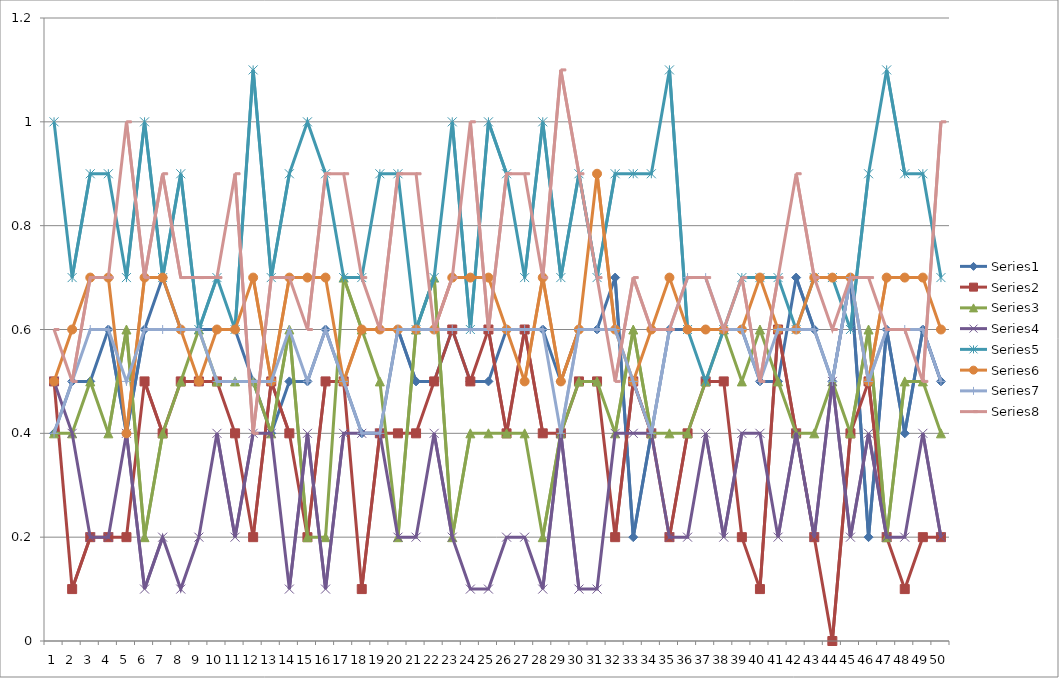
| Category | Series 0 | Series 1 | Series 2 | Series 3 | Series 4 | Series 5 | Series 6 | Series 7 |
|---|---|---|---|---|---|---|---|---|
| 0 | 0.4 | 0.5 | 0.4 | 0.5 | 1 | 0.5 | 0.4 | 0.6 |
| 1 | 0.5 | 0.1 | 0.4 | 0.4 | 0.7 | 0.6 | 0.5 | 0.5 |
| 2 | 0.5 | 0.2 | 0.5 | 0.2 | 0.9 | 0.7 | 0.6 | 0.7 |
| 3 | 0.6 | 0.2 | 0.4 | 0.2 | 0.9 | 0.7 | 0.6 | 0.7 |
| 4 | 0.4 | 0.2 | 0.6 | 0.4 | 0.7 | 0.4 | 0.5 | 1 |
| 5 | 0.6 | 0.5 | 0.2 | 0.1 | 1 | 0.7 | 0.6 | 0.7 |
| 6 | 0.7 | 0.4 | 0.4 | 0.2 | 0.7 | 0.7 | 0.6 | 0.9 |
| 7 | 0.6 | 0.5 | 0.5 | 0.1 | 0.9 | 0.6 | 0.6 | 0.7 |
| 8 | 0.6 | 0.5 | 0.6 | 0.2 | 0.6 | 0.5 | 0.6 | 0.7 |
| 9 | 0.6 | 0.5 | 0.5 | 0.4 | 0.7 | 0.6 | 0.5 | 0.7 |
| 10 | 0.6 | 0.4 | 0.5 | 0.2 | 0.6 | 0.6 | 0.5 | 0.9 |
| 11 | 0.5 | 0.2 | 0.5 | 0.4 | 1.1 | 0.7 | 0.5 | 0.4 |
| 12 | 0.4 | 0.5 | 0.4 | 0.4 | 0.7 | 0.5 | 0.5 | 0.7 |
| 13 | 0.5 | 0.4 | 0.6 | 0.1 | 0.9 | 0.7 | 0.6 | 0.7 |
| 14 | 0.5 | 0.2 | 0.2 | 0.4 | 1 | 0.7 | 0.5 | 0.6 |
| 15 | 0.6 | 0.5 | 0.2 | 0.1 | 0.9 | 0.7 | 0.6 | 0.9 |
| 16 | 0.5 | 0.5 | 0.7 | 0.4 | 0.7 | 0.5 | 0.5 | 0.9 |
| 17 | 0.4 | 0.1 | 0.6 | 0.4 | 0.7 | 0.6 | 0.4 | 0.7 |
| 18 | 0.4 | 0.4 | 0.5 | 0.4 | 0.9 | 0.6 | 0.4 | 0.6 |
| 19 | 0.6 | 0.4 | 0.2 | 0.2 | 0.9 | 0.6 | 0.6 | 0.9 |
| 20 | 0.5 | 0.4 | 0.6 | 0.2 | 0.6 | 0.6 | 0.6 | 0.9 |
| 21 | 0.5 | 0.5 | 0.7 | 0.4 | 0.7 | 0.6 | 0.6 | 0.6 |
| 22 | 0.6 | 0.6 | 0.2 | 0.2 | 1 | 0.7 | 0.6 | 0.7 |
| 23 | 0.5 | 0.5 | 0.4 | 0.1 | 0.6 | 0.7 | 0.6 | 1 |
| 24 | 0.5 | 0.6 | 0.4 | 0.1 | 1 | 0.7 | 0.6 | 0.6 |
| 25 | 0.6 | 0.4 | 0.4 | 0.2 | 0.9 | 0.6 | 0.6 | 0.9 |
| 26 | 0.6 | 0.6 | 0.4 | 0.2 | 0.7 | 0.5 | 0.6 | 0.9 |
| 27 | 0.6 | 0.4 | 0.2 | 0.1 | 1 | 0.7 | 0.6 | 0.7 |
| 28 | 0.5 | 0.4 | 0.4 | 0.4 | 0.7 | 0.5 | 0.4 | 1.1 |
| 29 | 0.6 | 0.5 | 0.5 | 0.1 | 0.9 | 0.6 | 0.6 | 0.9 |
| 30 | 0.6 | 0.5 | 0.5 | 0.1 | 0.7 | 0.9 | 0.6 | 0.7 |
| 31 | 0.7 | 0.2 | 0.4 | 0.4 | 0.9 | 0.6 | 0.6 | 0.5 |
| 32 | 0.2 | 0.5 | 0.6 | 0.4 | 0.9 | 0.5 | 0.5 | 0.7 |
| 33 | 0.4 | 0.4 | 0.4 | 0.4 | 0.9 | 0.6 | 0.4 | 0.6 |
| 34 | 0.6 | 0.2 | 0.4 | 0.2 | 1.1 | 0.7 | 0.6 | 0.6 |
| 35 | 0.6 | 0.4 | 0.4 | 0.2 | 0.6 | 0.6 | 0.7 | 0.7 |
| 36 | 0.6 | 0.5 | 0.5 | 0.4 | 0.5 | 0.6 | 0.7 | 0.7 |
| 37 | 0.6 | 0.5 | 0.6 | 0.2 | 0.6 | 0.6 | 0.6 | 0.6 |
| 38 | 0.6 | 0.2 | 0.5 | 0.4 | 0.7 | 0.6 | 0.6 | 0.7 |
| 39 | 0.5 | 0.1 | 0.6 | 0.4 | 0.7 | 0.7 | 0.5 | 0.5 |
| 40 | 0.5 | 0.6 | 0.5 | 0.2 | 0.7 | 0.6 | 0.6 | 0.7 |
| 41 | 0.7 | 0.4 | 0.4 | 0.4 | 0.6 | 0.6 | 0.6 | 0.9 |
| 42 | 0.6 | 0.2 | 0.4 | 0.2 | 0.7 | 0.7 | 0.6 | 0.7 |
| 43 | 0.5 | 0 | 0.5 | 0.5 | 0.7 | 0.7 | 0.5 | 0.6 |
| 44 | 0.7 | 0.4 | 0.4 | 0.2 | 0.6 | 0.7 | 0.7 | 0.7 |
| 45 | 0.2 | 0.5 | 0.6 | 0.4 | 0.9 | 0.5 | 0.5 | 0.7 |
| 46 | 0.6 | 0.2 | 0.2 | 0.2 | 1.1 | 0.7 | 0.6 | 0.6 |
| 47 | 0.4 | 0.1 | 0.5 | 0.2 | 0.9 | 0.7 | 0.6 | 0.6 |
| 48 | 0.6 | 0.2 | 0.5 | 0.4 | 0.9 | 0.7 | 0.6 | 0.5 |
| 49 | 0.5 | 0.2 | 0.4 | 0.2 | 0.7 | 0.6 | 0.5 | 1 |